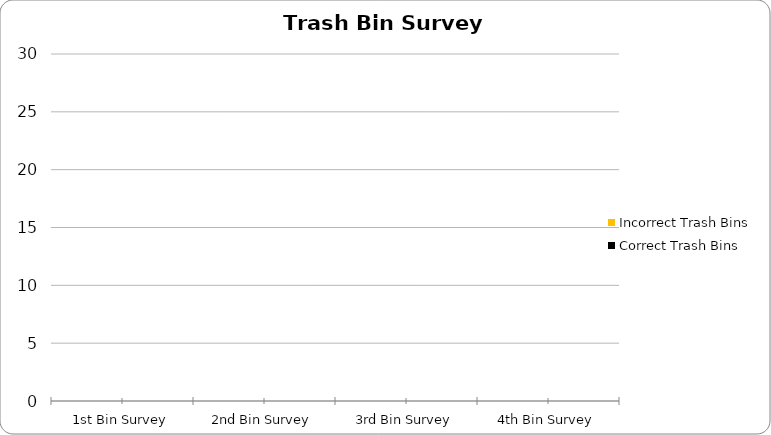
| Category | Incorrect Trash Bins | Correct Trash Bins |
|---|---|---|
| 1st Bin Survey | 0 | 0 |
| 2nd Bin Survey | 0 | 0 |
| 3rd Bin Survey | 0 | 0 |
| 4th Bin Survey | 0 | 0 |